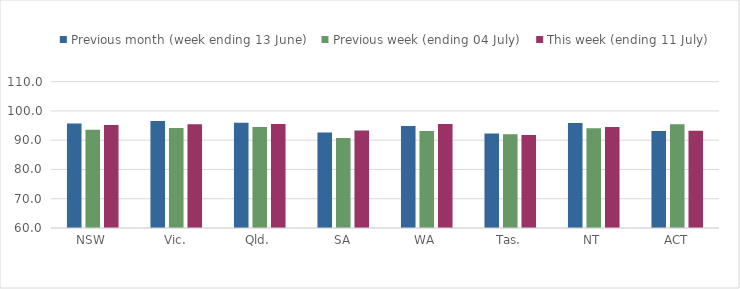
| Category | Previous month (week ending 13 June) | Previous week (ending 04 July) | This week (ending 11 July) |
|---|---|---|---|
| NSW | 95.66 | 93.548 | 95.171 |
| Vic. | 96.579 | 94.121 | 95.464 |
| Qld. | 95.934 | 94.496 | 95.499 |
| SA | 92.634 | 90.739 | 93.292 |
| WA | 94.877 | 93.13 | 95.52 |
| Tas. | 92.294 | 92.068 | 91.759 |
| NT | 95.833 | 94.109 | 94.526 |
| ACT | 93.12 | 95.446 | 93.203 |